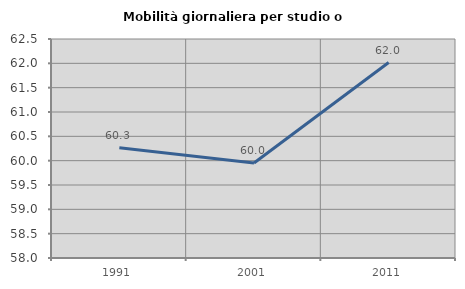
| Category | Mobilità giornaliera per studio o lavoro |
|---|---|
| 1991.0 | 60.263 |
| 2001.0 | 59.953 |
| 2011.0 | 62.017 |